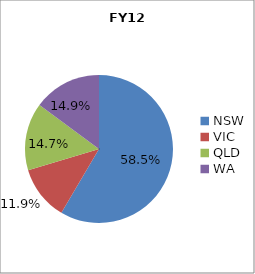
| Category | FY12 |
|---|---|
| NSW | 0.585 |
| VIC | 0.119 |
| QLD | 0.147 |
| WA | 0.149 |